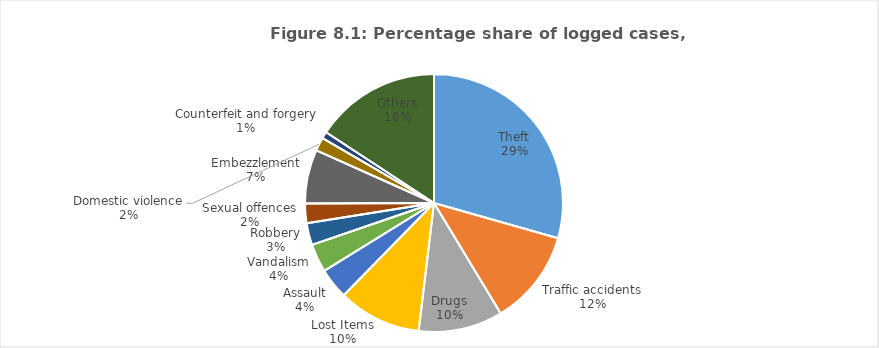
| Category | Series 0 |
|---|---|
| Theft | 29.403 |
| Traffic accidents | 11.947 |
| Drugs | 10.552 |
| Lost Items | 10.426 |
| Assault | 3.847 |
| Vandalism | 3.559 |
| Robbery | 2.747 |
| Sexual offences | 2.466 |
| Embezzlement | 6.749 |
| Domestic violence | 1.684 |
| Counterfeit and forgery | 0.857 |
| Others | 15.765 |